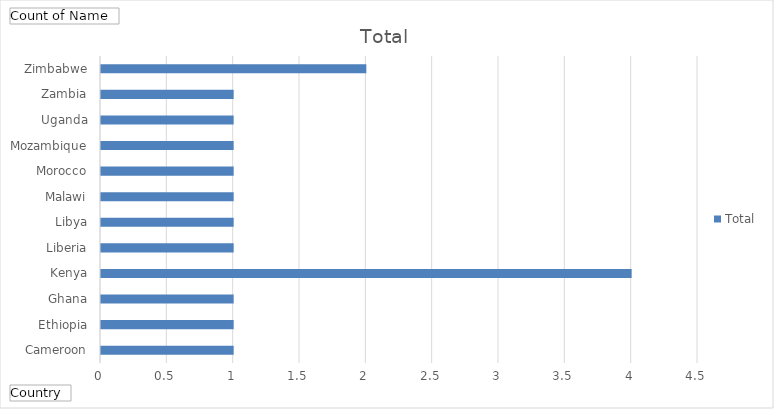
| Category | Total |
|---|---|
| Cameroon | 1 |
| Ethiopia | 1 |
| Ghana | 1 |
| Kenya | 4 |
| Liberia | 1 |
| Libya | 1 |
| Malawi | 1 |
| Morocco | 1 |
| Mozambique | 1 |
| Uganda | 1 |
| Zambia | 1 |
| Zimbabwe | 2 |